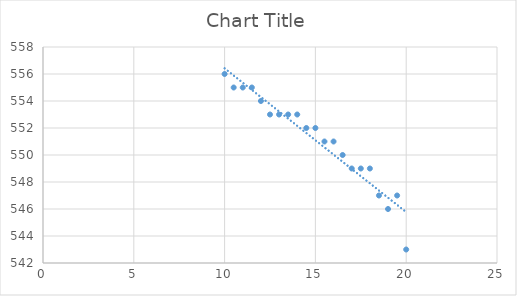
| Category | Series 0 |
|---|---|
| 20.0 | 543 |
| 19.5 | 547 |
| 19.0 | 546 |
| 18.5 | 547 |
| 18.0 | 549 |
| 17.5 | 549 |
| 17.0 | 549 |
| 16.5 | 550 |
| 16.0 | 551 |
| 15.5 | 551 |
| 15.0 | 552 |
| 14.5 | 552 |
| 14.0 | 553 |
| 13.5 | 553 |
| 13.0 | 553 |
| 12.5 | 553 |
| 12.0 | 554 |
| 11.5 | 555 |
| 11.0 | 555 |
| 10.5 | 555 |
| 10.0 | 556 |